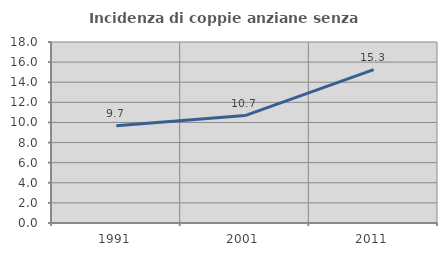
| Category | Incidenza di coppie anziane senza figli  |
|---|---|
| 1991.0 | 9.677 |
| 2001.0 | 10.682 |
| 2011.0 | 15.259 |